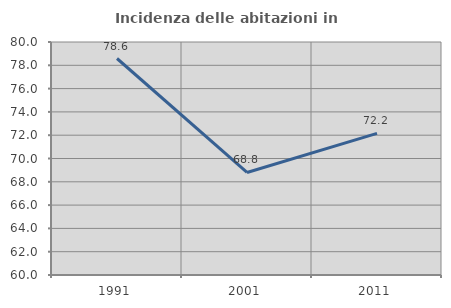
| Category | Incidenza delle abitazioni in proprietà  |
|---|---|
| 1991.0 | 78.584 |
| 2001.0 | 68.801 |
| 2011.0 | 72.159 |